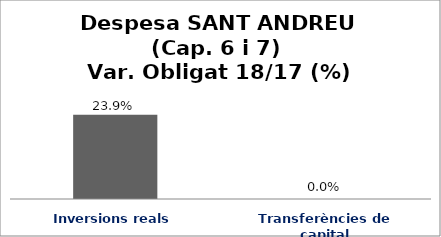
| Category | Series 0 |
|---|---|
| Inversions reals | 0.239 |
| Transferències de capital | 0 |